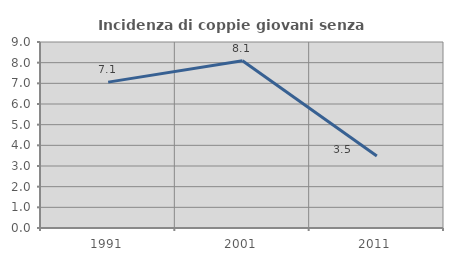
| Category | Incidenza di coppie giovani senza figli |
|---|---|
| 1991.0 | 7.059 |
| 2001.0 | 8.095 |
| 2011.0 | 3.483 |